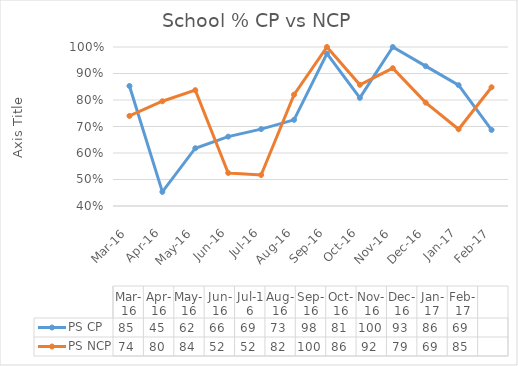
| Category | PS CP | PS NCP |
|---|---|---|
| 2016-03-16 | 0.853 | 0.74 |
| 2016-04-16 | 0.453 | 0.795 |
| 2016-05-16 | 0.618 | 0.837 |
| 2016-06-16 | 0.662 | 0.525 |
| 2016-07-16 | 0.69 | 0.517 |
| 2016-08-16 | 0.725 | 0.82 |
| 2016-09-16 | 0.975 | 1 |
| 2016-10-16 | 0.808 | 0.857 |
| 2016-11-16 | 1 | 0.92 |
| 2016-12-16 | 0.928 | 0.79 |
| 2017-01-16 | 0.856 | 0.69 |
| 2017-02-16 | 0.687 | 0.848 |